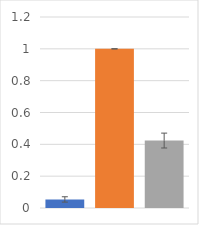
| Category | Series 0 |
|---|---|
| 0 | 0.054 |
| 1 | 1 |
| 2 | 0.424 |